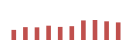
| Category | Importações (2) |
|---|---|
| 0 | 63256.661 |
| 1 | 80362.628 |
| 2 | 79098.748 |
| 3 | 89493.365 |
| 4 | 81914.569 |
| 5 | 86371.3 |
| 6 | 122399.001 |
| 7 | 125153.991 |
| 8 | 116754.909 |
| 9 | 109963.905 |